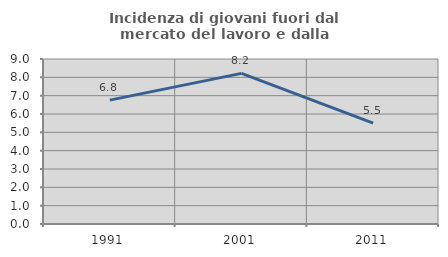
| Category | Incidenza di giovani fuori dal mercato del lavoro e dalla formazione  |
|---|---|
| 1991.0 | 6.757 |
| 2001.0 | 8.215 |
| 2011.0 | 5.498 |